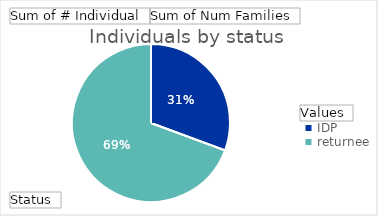
| Category | Sum of # Individual | Sum of Num Families |
|---|---|---|
| IDP | 1173 | 210 |
| returnee | 2656 | 477 |